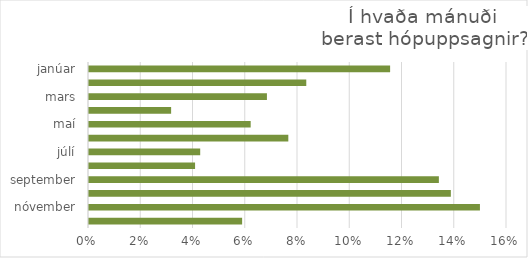
| Category | Series 0 |
|---|---|
| janúar | 0.115 |
| febrúar | 0.083 |
| mars | 0.068 |
| apríl | 0.031 |
| maí | 0.062 |
| júní | 0.076 |
| júlí | 0.043 |
| ágúst | 0.041 |
| september | 0.134 |
| október | 0.139 |
| nóvember | 0.15 |
| desember | 0.059 |